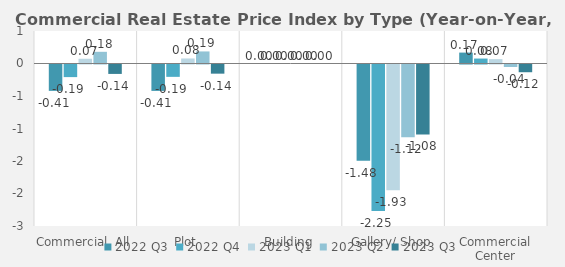
| Category | 2022 | 2023 |
|---|---|---|
| Commercial, All | -0.194 | -0.145 |
| Plot | -0.19 | -0.141 |
| Building | 0 | 0 |
| Gallery/ Shop | -2.252 | -1.075 |
| Commercial Center | 0.076 | -0.119 |